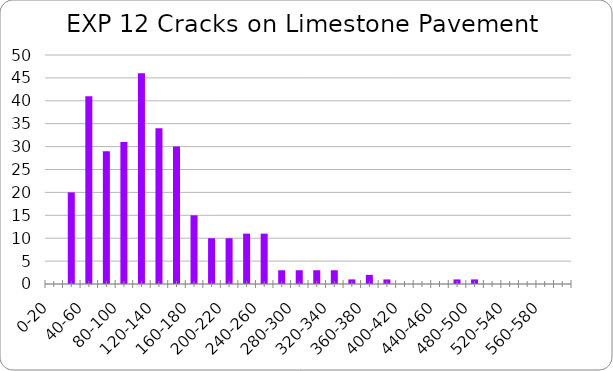
| Category | Series 0 |
|---|---|
| 0-20 | 0 |
| 20-40 | 20 |
| 40-60 | 41 |
| 60-80 | 29 |
| 80-100 | 31 |
| 100-120 | 46 |
| 120-140 | 34 |
| 140-160 | 30 |
| 160-180 | 15 |
| 180-200 | 10 |
| 200-220 | 10 |
| 220-240 | 11 |
| 240-260 | 11 |
| 260-280 | 3 |
| 280-300 | 3 |
| 300-320 | 3 |
| 320-340 | 3 |
| 340-360 | 1 |
| 360-380 | 2 |
| 380-400 | 1 |
| 400-420 | 0 |
| 420-440 | 0 |
| 440-460 | 0 |
| 460-480 | 1 |
| 480-500 | 1 |
| 500-520 | 0 |
| 520-540 | 0 |
| 540-560 | 0 |
| 560-580 | 0 |
| 580-600 | 0 |